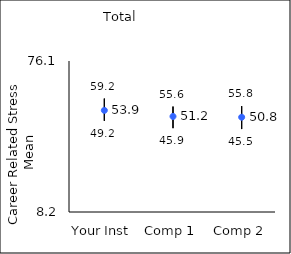
| Category | 25th percentile | 75th percentile | Mean |
|---|---|---|---|
| Your Inst | 49.2 | 59.2 | 53.9 |
| Comp 1 | 45.9 | 55.6 | 51.17 |
| Comp 2 | 45.5 | 55.8 | 50.82 |